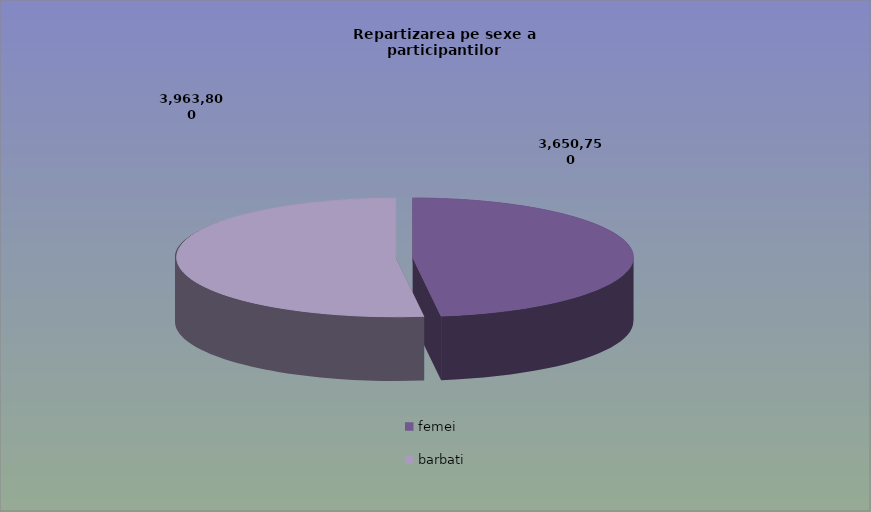
| Category | Series 0 |
|---|---|
| femei | 3650750 |
| barbati | 3963800 |